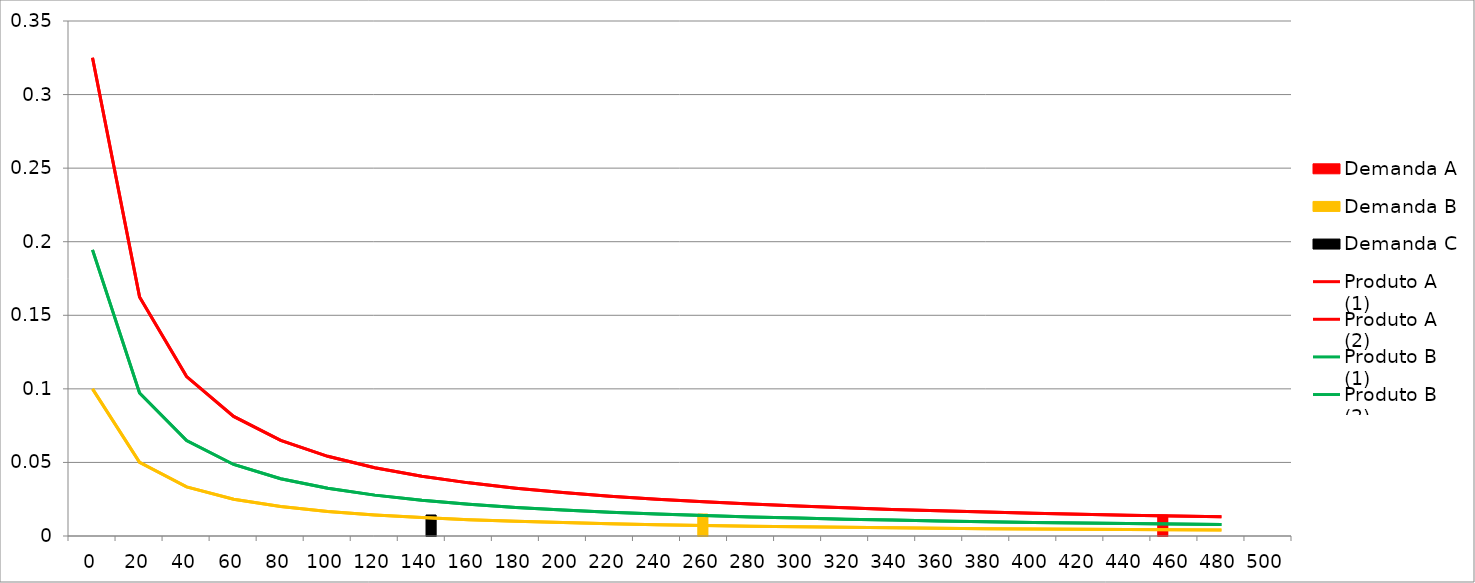
| Category | Demanda A | Demanda B | Demanda C |
|---|---|---|---|
| 0.0 | 0 | 0 | 0 |
| 20.0 | 0 | 0 | 0 |
| 40.0 | 0 | 0 | 0 |
| 60.0 | 0 | 0 | 0 |
| 80.0 | 0 | 0 | 0 |
| 100.0 | 0 | 0 | 0 |
| 120.0 | 0 | 0 | 0 |
| 140.0 | 0 | 0 | 0.014 |
| 160.0 | 0 | 0 | 0 |
| 180.0 | 0 | 0 | 0 |
| 200.0 | 0 | 0 | 0 |
| 220.0 | 0 | 0 | 0 |
| 240.0 | 0 | 0 | 0 |
| 260.0 | 0 | 0.015 | 0 |
| 280.0 | 0 | 0 | 0 |
| 300.0 | 0 | 0 | 0 |
| 320.0 | 0 | 0 | 0 |
| 340.0 | 0 | 0 | 0 |
| 360.0 | 0 | 0 | 0 |
| 380.0 | 0 | 0 | 0 |
| 400.0 | 0 | 0 | 0 |
| 420.0 | 0 | 0 | 0 |
| 440.0 | 0 | 0 | 0 |
| 460.0 | 0.014 | 0 | 0 |
| 480.0 | 0 | 0 | 0 |
| 500.0 | 0 | 0 | 0 |